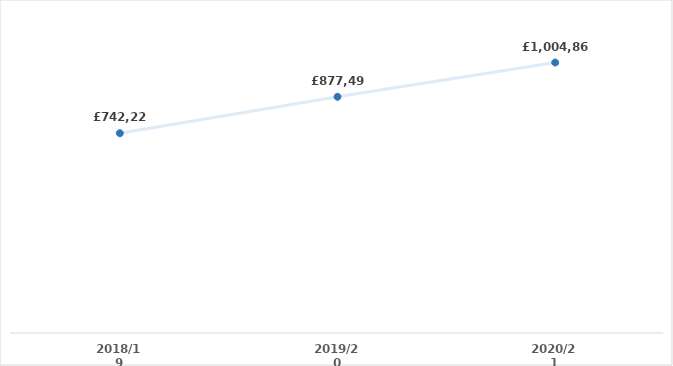
| Category | Series 0 |
|---|---|
| 2018/19 | 742228.21 |
| 2019/20 | 877498.73 |
| 2020/21 | 1004862.92 |